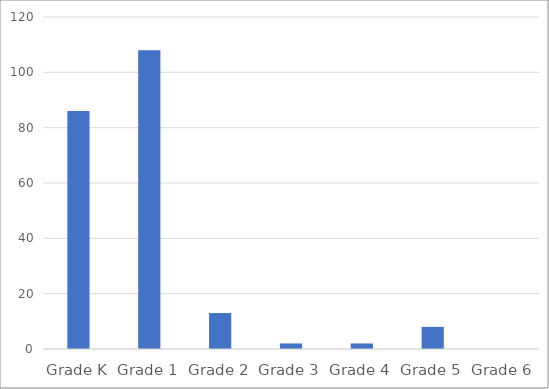
| Category | Series 0 |
|---|---|
| Grade K | 86 |
| Grade 1 | 108 |
| Grade 2 | 13 |
| Grade 3 | 2 |
| Grade 4 | 2 |
| Grade 5 | 8 |
| Grade 6 | 0 |